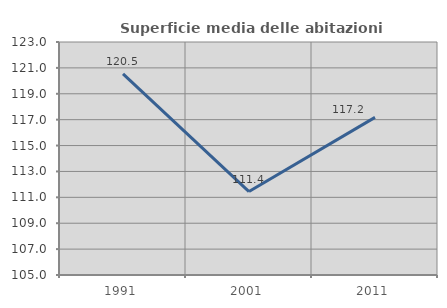
| Category | Superficie media delle abitazioni occupate |
|---|---|
| 1991.0 | 120.536 |
| 2001.0 | 111.446 |
| 2011.0 | 117.179 |